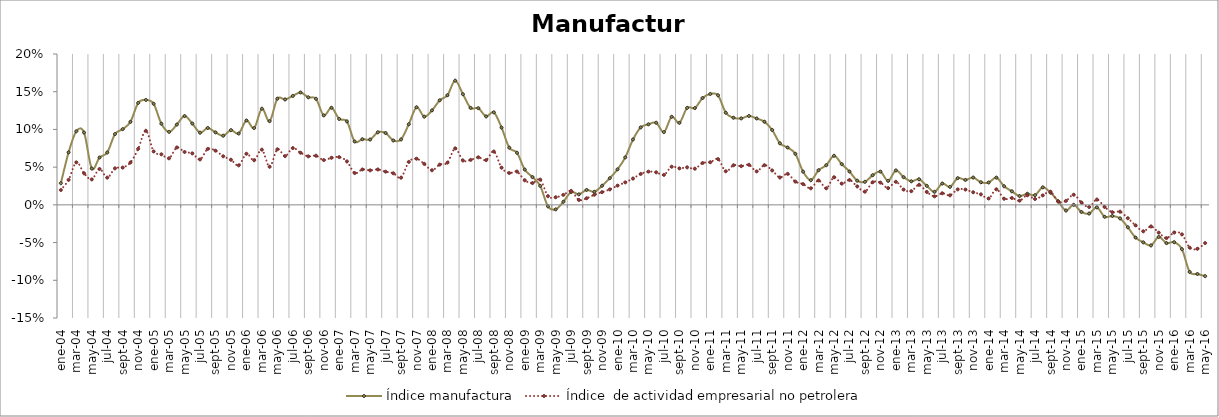
| Category | Índice manufactura | Índice  de actividad empresarial no petrolera |
|---|---|---|
| 2004-01-01 | 0.029 | 0.02 |
| 2004-02-01 | 0.07 | 0.033 |
| 2004-03-01 | 0.098 | 0.056 |
| 2004-04-01 | 0.096 | 0.042 |
| 2004-05-01 | 0.048 | 0.034 |
| 2004-06-01 | 0.063 | 0.048 |
| 2004-07-01 | 0.069 | 0.036 |
| 2004-08-01 | 0.094 | 0.048 |
| 2004-09-01 | 0.1 | 0.049 |
| 2004-10-01 | 0.11 | 0.056 |
| 2004-11-01 | 0.135 | 0.074 |
| 2004-12-01 | 0.139 | 0.098 |
| 2005-01-01 | 0.134 | 0.071 |
| 2005-02-01 | 0.108 | 0.067 |
| 2005-03-01 | 0.097 | 0.062 |
| 2005-04-01 | 0.106 | 0.076 |
| 2005-05-01 | 0.118 | 0.07 |
| 2005-06-01 | 0.108 | 0.068 |
| 2005-07-01 | 0.096 | 0.06 |
| 2005-08-01 | 0.102 | 0.074 |
| 2005-09-01 | 0.096 | 0.072 |
| 2005-10-01 | 0.092 | 0.064 |
| 2005-11-01 | 0.099 | 0.06 |
| 2005-12-01 | 0.095 | 0.052 |
| 2006-01-01 | 0.112 | 0.068 |
| 2006-02-01 | 0.102 | 0.059 |
| 2006-03-01 | 0.127 | 0.073 |
| 2006-04-01 | 0.111 | 0.051 |
| 2006-05-01 | 0.141 | 0.074 |
| 2006-06-01 | 0.14 | 0.065 |
| 2006-07-01 | 0.144 | 0.075 |
| 2006-08-01 | 0.149 | 0.069 |
| 2006-09-01 | 0.143 | 0.064 |
| 2006-10-01 | 0.141 | 0.065 |
| 2006-11-01 | 0.119 | 0.059 |
| 2006-12-01 | 0.129 | 0.062 |
| 2007-01-01 | 0.114 | 0.063 |
| 2007-02-01 | 0.111 | 0.058 |
| 2007-03-01 | 0.084 | 0.042 |
| 2007-04-01 | 0.087 | 0.047 |
| 2007-05-01 | 0.087 | 0.046 |
| 2007-06-01 | 0.096 | 0.047 |
| 2007-07-01 | 0.095 | 0.044 |
| 2007-08-01 | 0.085 | 0.042 |
| 2007-09-01 | 0.087 | 0.036 |
| 2007-10-01 | 0.107 | 0.057 |
| 2007-11-01 | 0.129 | 0.061 |
| 2007-12-01 | 0.117 | 0.054 |
| 2008-01-01 | 0.125 | 0.046 |
| 2008-02-01 | 0.139 | 0.053 |
| 2008-03-01 | 0.145 | 0.056 |
| 2008-04-01 | 0.165 | 0.075 |
| 2008-05-01 | 0.147 | 0.059 |
| 2008-06-01 | 0.128 | 0.06 |
| 2008-07-01 | 0.128 | 0.063 |
| 2008-08-01 | 0.117 | 0.059 |
| 2008-09-01 | 0.123 | 0.071 |
| 2008-10-01 | 0.102 | 0.049 |
| 2008-11-01 | 0.076 | 0.042 |
| 2008-12-01 | 0.069 | 0.044 |
| 2009-01-01 | 0.047 | 0.033 |
| 2009-02-01 | 0.037 | 0.029 |
| 2009-03-01 | 0.025 | 0.033 |
| 2009-04-01 | -0.002 | 0.012 |
| 2009-05-01 | -0.006 | 0.01 |
| 2009-06-01 | 0.004 | 0.013 |
| 2009-07-01 | 0.017 | 0.019 |
| 2009-08-01 | 0.014 | 0.006 |
| 2009-09-01 | 0.02 | 0.009 |
| 2009-10-01 | 0.017 | 0.013 |
| 2009-11-01 | 0.025 | 0.017 |
| 2009-12-01 | 0.035 | 0.02 |
| 2010-01-01 | 0.047 | 0.026 |
| 2010-02-01 | 0.063 | 0.03 |
| 2010-03-01 | 0.087 | 0.035 |
| 2010-04-01 | 0.103 | 0.041 |
| 2010-05-01 | 0.107 | 0.044 |
| 2010-06-01 | 0.109 | 0.043 |
| 2010-07-01 | 0.096 | 0.04 |
| 2010-08-01 | 0.117 | 0.051 |
| 2010-09-01 | 0.109 | 0.048 |
| 2010-10-01 | 0.129 | 0.05 |
| 2010-11-01 | 0.128 | 0.048 |
| 2010-12-01 | 0.142 | 0.055 |
| 2011-01-01 | 0.147 | 0.057 |
| 2011-02-01 | 0.145 | 0.061 |
| 2011-03-01 | 0.122 | 0.045 |
| 2011-04-01 | 0.115 | 0.053 |
| 2011-05-01 | 0.115 | 0.051 |
| 2011-06-01 | 0.118 | 0.053 |
| 2011-07-01 | 0.115 | 0.044 |
| 2011-08-01 | 0.11 | 0.053 |
| 2011-09-01 | 0.099 | 0.046 |
| 2011-10-01 | 0.082 | 0.036 |
| 2011-11-01 | 0.076 | 0.041 |
| 2011-12-01 | 0.068 | 0.031 |
| 2012-01-01 | 0.044 | 0.028 |
| 2012-02-01 | 0.033 | 0.022 |
| 2012-03-01 | 0.046 | 0.032 |
| 2012-04-01 | 0.053 | 0.022 |
| 2012-05-01 | 0.065 | 0.037 |
| 2012-06-01 | 0.054 | 0.028 |
| 2012-07-01 | 0.044 | 0.033 |
| 2012-08-01 | 0.032 | 0.024 |
| 2012-09-01 | 0.031 | 0.018 |
| 2012-10-01 | 0.039 | 0.03 |
| 2012-11-01 | 0.044 | 0.03 |
| 2012-12-01 | 0.032 | 0.022 |
| 2013-01-01 | 0.046 | 0.031 |
| 2013-02-01 | 0.037 | 0.02 |
| 2013-03-01 | 0.031 | 0.018 |
| 2013-04-01 | 0.034 | 0.027 |
| 2013-05-01 | 0.025 | 0.017 |
| 2013-06-01 | 0.017 | 0.011 |
| 2013-07-01 | 0.028 | 0.015 |
| 2013-08-01 | 0.024 | 0.013 |
| 2013-09-01 | 0.035 | 0.021 |
| 2013-10-01 | 0.033 | 0.02 |
| 2013-11-01 | 0.036 | 0.017 |
| 2013-12-01 | 0.03 | 0.014 |
| 2014-01-01 | 0.03 | 0.008 |
| 2014-02-01 | 0.036 | 0.021 |
| 2014-03-01 | 0.025 | 0.008 |
| 2014-04-01 | 0.018 | 0.009 |
| 2014-05-01 | 0.012 | 0.006 |
| 2014-06-01 | 0.015 | 0.013 |
| 2014-07-01 | 0.013 | 0.008 |
| 2014-08-01 | 0.023 | 0.013 |
| 2014-09-01 | 0.016 | 0.017 |
| 2014-10-01 | 0.005 | 0.004 |
| 2014-11-01 | -0.008 | 0.005 |
| 2014-12-01 | 0 | 0.013 |
| 2015-01-01 | -0.009 | 0.003 |
| 2015-02-01 | -0.012 | -0.003 |
| 2015-03-01 | -0.003 | 0.007 |
| 2015-04-01 | -0.016 | -0.003 |
| 2015-05-01 | -0.015 | -0.01 |
| 2015-06-01 | -0.018 | -0.009 |
| 2015-07-01 | -0.03 | -0.018 |
| 2015-08-01 | -0.043 | -0.027 |
| 2015-09-01 | -0.05 | -0.035 |
| 2015-10-01 | -0.054 | -0.029 |
| 2015-11-01 | -0.042 | -0.037 |
| 2015-12-01 | -0.051 | -0.044 |
| 2016-01-01 | -0.05 | -0.037 |
| 2016-02-01 | -0.059 | -0.039 |
| 2016-03-01 | -0.089 | -0.057 |
| 2016-04-01 | -0.092 | -0.058 |
| 2016-05-01 | -0.095 | -0.051 |